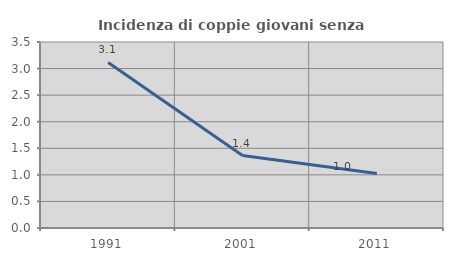
| Category | Incidenza di coppie giovani senza figli |
|---|---|
| 1991.0 | 3.115 |
| 2001.0 | 1.364 |
| 2011.0 | 1.026 |